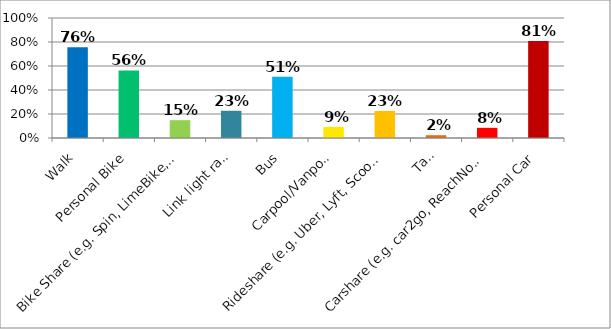
| Category | Responses |
|---|---|
| Walk | 0.757 |
| Personal Bike | 0.563 |
| Bike Share (e.g. Spin, LimeBike, ofo) | 0.148 |
| Link light rail | 0.227 |
| Bus | 0.51 |
| Carpool/Vanpool | 0.092 |
| Rideshare (e.g. Uber, Lyft, Scoop) | 0.226 |
| Taxi | 0.023 |
| Carshare (e.g. car2go, ReachNow, ZipCar) | 0.085 |
| Personal Car | 0.809 |